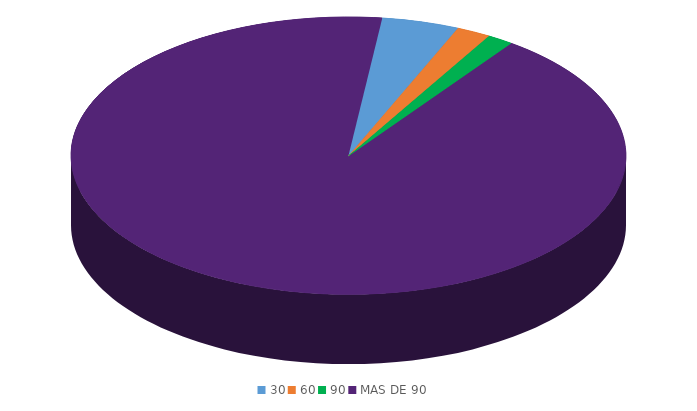
| Category | Series 0 |
|---|---|
| 30 | 1607331.9 |
| 60 | 714369.7 |
| 90 | 535777.3 |
| MAS DE 90 | 32861007.3 |